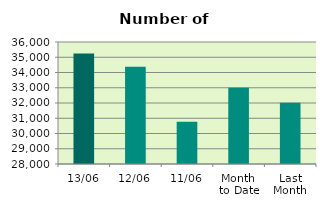
| Category | Series 0 |
|---|---|
| 13/06 | 35240 |
| 12/06 | 34370 |
| 11/06 | 30770 |
| Month 
to Date | 32996.222 |
| Last
Month | 32020.364 |